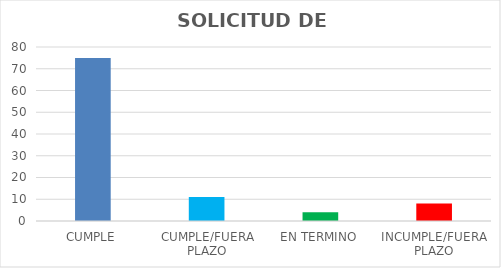
| Category | TOTAL |
|---|---|
| CUMPLE | 75 |
| CUMPLE/FUERA PLAZO | 11 |
| EN TERMINO | 4 |
| INCUMPLE/FUERA PLAZO | 8 |